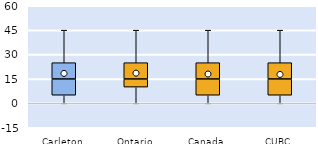
| Category | 25th | 50th | 75th |
|---|---|---|---|
| Carleton | 5 | 10 | 10 |
| Ontario | 10 | 5 | 10 |
| Canada | 5 | 10 | 10 |
| CUBC | 5 | 10 | 10 |